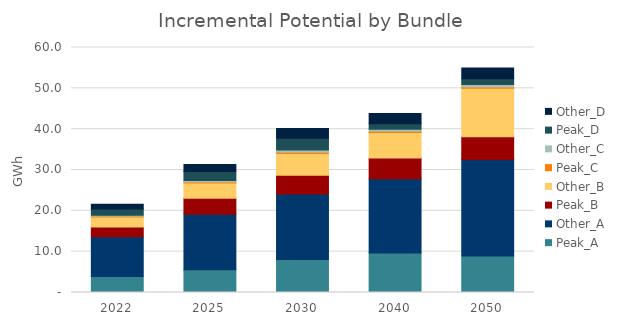
| Category | Peak_A | Other_A | Peak_B | Other_B | Peak_C | Other_C | Peak_D | Other_D |
|---|---|---|---|---|---|---|---|---|
| 2022.0 | 3.908 | 9.751 | 2.391 | 2.445 | 0.177 | 0.242 | 1.548 | 1.161 |
| 2025.0 | 5.56 | 13.604 | 3.916 | 3.763 | 0.224 | 0.381 | 2.196 | 1.731 |
| 2030.0 | 8.069 | 16.07 | 4.577 | 5.335 | 0.283 | 0.549 | 2.876 | 2.407 |
| 2040.0 | 9.696 | 18.136 | 5.127 | 6.23 | 0.294 | 0.487 | 1.357 | 2.511 |
| 2050.0 | 8.957 | 23.602 | 5.584 | 11.849 | 0.333 | 0.64 | 1.4 | 2.595 |